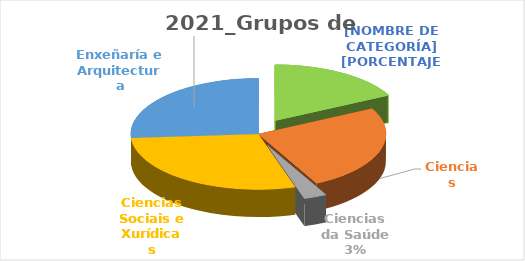
| Category | Series 0 |
|---|---|
| Artes e Humanidades | 30 |
| Ciencias | 43 |
| Ciencias da Saúde | 5 |
| Ciencias Sociais e Xurídicas | 49 |
| Enxeñaría e Arquitectura | 45 |